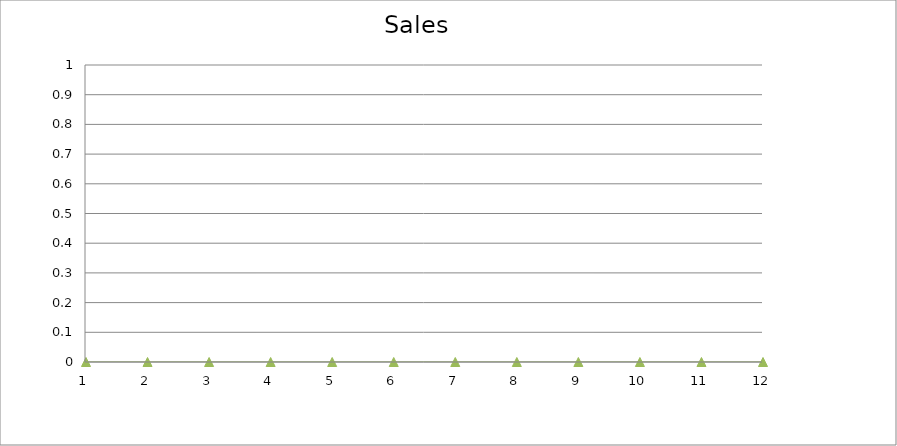
| Category | Actual |
|---|---|
| 0 | 1960 |
| 1 | 1210 |
| 2 | 1420 |
| 3 | 780 |
| 4 | 3030 |
| 5 | 1170 |
| 6 | 1520 |
| 7 | 690 |
| 8 | 1660 |
| 9 | 960 |
| 10 | 1810 |
| 11 | 2350 |